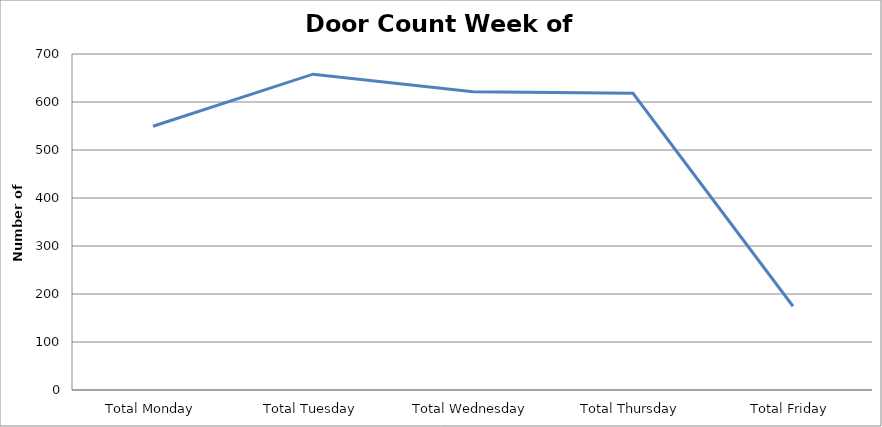
| Category | Series 0 |
|---|---|
| Total Monday | 549.5 |
| Total Tuesday | 658 |
| Total Wednesday | 621.5 |
| Total Thursday | 618 |
| Total Friday | 174.5 |